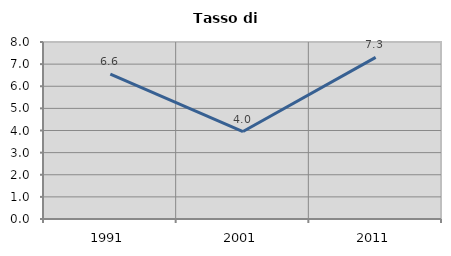
| Category | Tasso di disoccupazione   |
|---|---|
| 1991.0 | 6.553 |
| 2001.0 | 3.952 |
| 2011.0 | 7.303 |